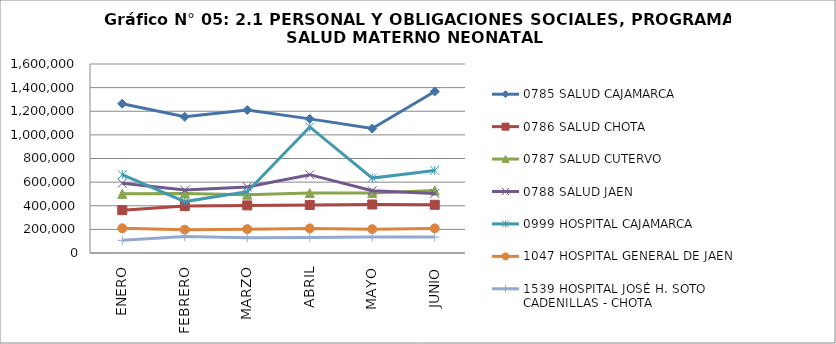
| Category | 0785 SALUD CAJAMARCA | 0786 SALUD CHOTA | 0787 SALUD CUTERVO | 0788 SALUD JAEN | 0999 HOSPITAL CAJAMARCA | 1047 HOSPITAL GENERAL DE JAEN | 1539 HOSPITAL JOSÉ H. SOTO CADENILLAS - CHOTA |
|---|---|---|---|---|---|---|---|
| ENERO | 1263815 | 362896 | 500614 | 590317 | 662986 | 208983 | 107029 |
| FEBRERO | 1152847 | 397346 | 503633 | 533265 | 435105 | 197238 | 138734 |
| MARZO | 1210260 | 403115 | 493074 | 559603 | 519110 | 201894 | 130144 |
| ABRIL | 1135489 | 406871 | 507637 | 663174 | 1067114 | 208132 | 131965 |
| MAYO | 1053759 | 410505 | 507444 | 527005 | 634287 | 201811 | 134554 |
| JUNIO | 1367582 | 408268 | 528438 | 504143 | 699008 | 208279 | 134408 |